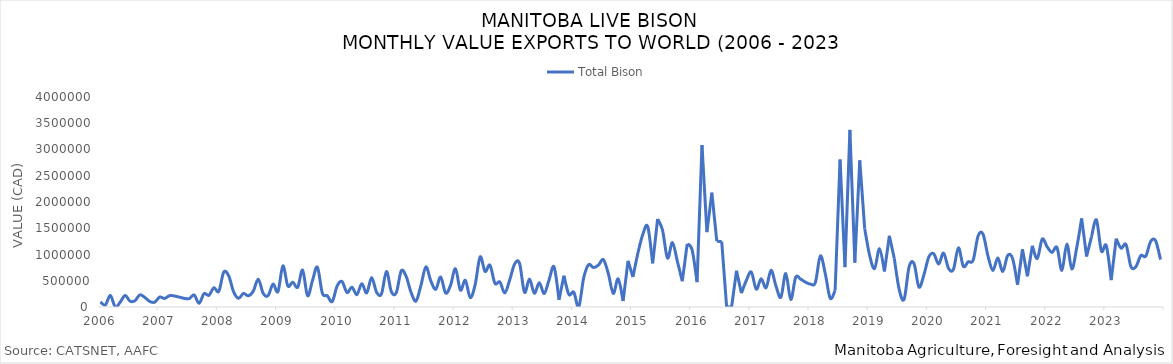
| Category | Total Bison |
|---|---|
| 2006-01-01 | 94831 |
| 2006-02-01 | 39924 |
| 2006-03-01 | 221638 |
| 2006-04-01 | 0 |
| 2006-05-01 | 92421 |
| 2006-06-01 | 219057 |
| 2006-07-01 | 110957 |
| 2006-08-01 | 120486 |
| 2006-09-01 | 231165 |
| 2006-10-01 | 181592 |
| 2006-11-01 | 104701 |
| 2006-12-01 | 91894 |
| 2007-01-01 | 189119 |
| 2007-02-01 | 162426 |
| 2007-03-01 | 216115 |
| 2007-04-01 | 209962 |
| 2007-05-01 | 187979 |
| 2007-06-01 | 164889 |
| 2007-07-01 | 158492 |
| 2007-08-01 | 229251 |
| 2007-09-01 | 70037 |
| 2007-10-01 | 253310 |
| 2007-11-01 | 222501 |
| 2007-12-01 | 366639 |
| 2008-01-01 | 298590 |
| 2008-02-01 | 664293 |
| 2008-03-01 | 595580 |
| 2008-04-01 | 290569 |
| 2008-05-01 | 165602 |
| 2008-06-01 | 258092 |
| 2008-07-01 | 213325 |
| 2008-08-01 | 302841 |
| 2008-09-01 | 529307 |
| 2008-10-01 | 260626 |
| 2008-11-01 | 217450 |
| 2008-12-01 | 435997 |
| 2009-01-01 | 293947 |
| 2009-02-01 | 783238 |
| 2009-03-01 | 401225 |
| 2009-04-01 | 473013 |
| 2009-05-01 | 376289 |
| 2009-06-01 | 702041 |
| 2009-07-01 | 214676 |
| 2009-08-01 | 503890 |
| 2009-09-01 | 758535 |
| 2009-10-01 | 263519 |
| 2009-11-01 | 213775 |
| 2009-12-01 | 103173 |
| 2010-01-01 | 400215 |
| 2010-02-01 | 484084 |
| 2010-03-01 | 275903 |
| 2010-04-01 | 377853 |
| 2010-05-01 | 234758 |
| 2010-06-01 | 444536 |
| 2010-07-01 | 268996 |
| 2010-08-01 | 561166 |
| 2010-09-01 | 280590 |
| 2010-10-01 | 250989 |
| 2010-11-01 | 678321 |
| 2010-12-01 | 290670 |
| 2011-01-01 | 272699 |
| 2011-02-01 | 688240 |
| 2011-03-01 | 582531 |
| 2011-04-01 | 276345 |
| 2011-05-01 | 113595 |
| 2011-06-01 | 412650 |
| 2011-07-01 | 764770 |
| 2011-08-01 | 498377 |
| 2011-09-01 | 336222 |
| 2011-10-01 | 571497 |
| 2011-11-01 | 266400 |
| 2011-12-01 | 412232 |
| 2012-01-01 | 729575 |
| 2012-02-01 | 321496 |
| 2012-03-01 | 508652 |
| 2012-04-01 | 179064 |
| 2012-05-01 | 428861 |
| 2012-06-01 | 955157 |
| 2012-07-01 | 676923 |
| 2012-08-01 | 797322 |
| 2012-09-01 | 452054 |
| 2012-10-01 | 477165 |
| 2012-11-01 | 267645 |
| 2012-12-01 | 515680 |
| 2013-01-01 | 820069 |
| 2013-02-01 | 830307 |
| 2013-03-01 | 281383 |
| 2013-04-01 | 532884 |
| 2013-05-01 | 261706 |
| 2013-06-01 | 462111 |
| 2013-07-01 | 256069 |
| 2013-08-01 | 522091 |
| 2013-09-01 | 764483 |
| 2013-10-01 | 137054 |
| 2013-11-01 | 596471 |
| 2013-12-01 | 239079 |
| 2014-01-01 | 281263 |
| 2014-02-01 | 0 |
| 2014-03-01 | 553983 |
| 2014-04-01 | 805179 |
| 2014-05-01 | 750543 |
| 2014-06-01 | 798681 |
| 2014-07-01 | 901252 |
| 2014-08-01 | 636624 |
| 2014-09-01 | 257767 |
| 2014-10-01 | 536204 |
| 2014-11-01 | 113430 |
| 2014-12-01 | 879496 |
| 2015-01-01 | 571277 |
| 2015-02-01 | 1026996 |
| 2015-03-01 | 1383354 |
| 2015-04-01 | 1529690 |
| 2015-05-01 | 830315 |
| 2015-06-01 | 1676369 |
| 2015-07-01 | 1462291 |
| 2015-08-01 | 931601 |
| 2015-09-01 | 1226594 |
| 2015-10-01 | 872505 |
| 2015-11-01 | 491413 |
| 2015-12-01 | 1202962 |
| 2016-01-01 | 1085929 |
| 2016-02-01 | 473153 |
| 2016-03-01 | 3084377 |
| 2016-04-01 | 1426302 |
| 2016-05-01 | 2177788 |
| 2016-06-01 | 1253102 |
| 2016-07-01 | 1245126 |
| 2016-08-01 | 0 |
| 2016-09-01 | 0 |
| 2016-10-01 | 691104 |
| 2016-11-01 | 264327 |
| 2016-12-01 | 508586 |
| 2017-01-01 | 666139 |
| 2017-02-01 | 340391 |
| 2017-03-01 | 537951 |
| 2017-04-01 | 367315 |
| 2017-05-01 | 699820 |
| 2017-06-01 | 401823 |
| 2017-07-01 | 185145 |
| 2017-08-01 | 639701 |
| 2017-09-01 | 143343 |
| 2017-10-01 | 565550 |
| 2017-11-01 | 530933 |
| 2017-12-01 | 472384 |
| 2018-01-01 | 435926 |
| 2018-02-01 | 468491 |
| 2018-03-01 | 972583 |
| 2018-04-01 | 635751 |
| 2018-05-01 | 166706 |
| 2018-06-01 | 314702 |
| 2018-07-01 | 2809004 |
| 2018-08-01 | 759613 |
| 2018-09-01 | 3373651 |
| 2018-10-01 | 844363 |
| 2018-11-01 | 2794399 |
| 2018-12-01 | 1492531 |
| 2019-01-01 | 983170 |
| 2019-02-01 | 732563 |
| 2019-03-01 | 1109151 |
| 2019-04-01 | 677644 |
| 2019-05-01 | 1355644 |
| 2019-06-01 | 924803 |
| 2019-07-01 | 331652 |
| 2019-08-01 | 149831 |
| 2019-09-01 | 762568 |
| 2019-10-01 | 827801 |
| 2019-11-01 | 379587 |
| 2019-12-01 | 610154 |
| 2020-01-01 | 952571 |
| 2020-02-01 | 1013617 |
| 2020-03-01 | 818116 |
| 2020-04-01 | 1027132 |
| 2020-05-01 | 735982 |
| 2020-06-01 | 717059 |
| 2020-07-01 | 1128385 |
| 2020-08-01 | 776061 |
| 2020-09-01 | 860401 |
| 2020-10-01 | 893267 |
| 2020-11-01 | 1353911 |
| 2020-12-01 | 1387658 |
| 2021-01-01 | 972210 |
| 2021-02-01 | 695060 |
| 2021-03-01 | 935654 |
| 2021-04-01 | 675493 |
| 2021-05-01 | 980266 |
| 2021-06-01 | 922153 |
| 2021-07-01 | 425086 |
| 2021-08-01 | 1099720 |
| 2021-09-01 | 583944 |
| 2021-10-01 | 1164719 |
| 2021-11-01 | 924085 |
| 2021-12-01 | 1293322 |
| 2022-01-01 | 1146062 |
| 2022-02-01 | 1039337 |
| 2022-03-01 | 1133703 |
| 2022-04-01 | 697376 |
| 2022-05-01 | 1198467 |
| 2022-06-01 | 724310 |
| 2022-07-01 | 1129588 |
| 2022-08-01 | 1688071 |
| 2022-09-01 | 962418 |
| 2022-10-01 | 1338155 |
| 2022-11-01 | 1658125 |
| 2022-12-01 | 1068399 |
| 2023-01-01 | 1167659 |
| 2023-02-01 | 510887 |
| 2023-03-01 | 1301802 |
| 2023-04-01 | 1122006 |
| 2023-05-01 | 1188122 |
| 2023-06-01 | 767578 |
| 2023-07-01 | 769575 |
| 2023-08-01 | 979606 |
| 2023-09-01 | 968350 |
| 2023-10-01 | 1248484 |
| 2023-11-01 | 1261710 |
| 2023-12-01 | 903435 |